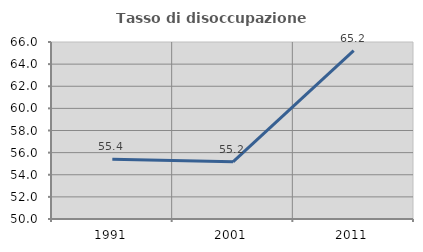
| Category | Tasso di disoccupazione giovanile  |
|---|---|
| 1991.0 | 55.405 |
| 2001.0 | 55.172 |
| 2011.0 | 65.217 |